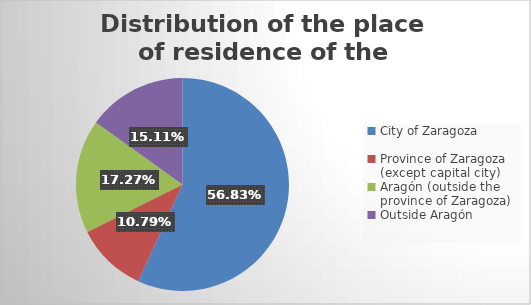
| Category | Series 0 |
|---|---|
| City of Zaragoza | 79 |
| Province of Zaragoza (except capital city) | 15 |
| Aragón (outside the province of Zaragoza) | 24 |
| Outside Aragón | 21 |